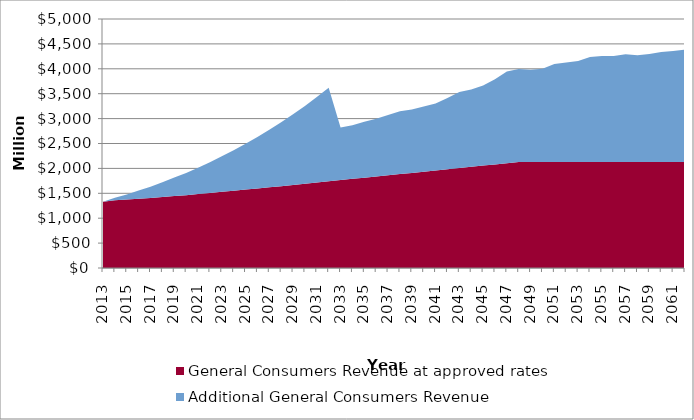
| Category | General Consumers Revenue at approved rates | Additional General Consumers Revenue |
|---|---|---|
| 2013.0 | 1331 | 0 |
| 2014.0 | 1361 | 48 |
| 2015.0 | 1374 | 104 |
| 2016.0 | 1390 | 164 |
| 2017.0 | 1404 | 228 |
| 2018.0 | 1424 | 297 |
| 2019.0 | 1447 | 370 |
| 2020.0 | 1462 | 447 |
| 2021.0 | 1485 | 530 |
| 2022.0 | 1506 | 619 |
| 2023.0 | 1529 | 713 |
| 2024.0 | 1552 | 814 |
| 2025.0 | 1575 | 921 |
| 2026.0 | 1598 | 1034 |
| 2027.0 | 1621 | 1154 |
| 2028.0 | 1644 | 1282 |
| 2029.0 | 1669 | 1418 |
| 2030.0 | 1693 | 1562 |
| 2031.0 | 1717 | 1715 |
| 2032.0 | 1741 | 1876 |
| 2033.0 | 1765 | 1057 |
| 2034.0 | 1790 | 1076 |
| 2035.0 | 1814 | 1123 |
| 2036.0 | 1838 | 1157 |
| 2037.0 | 1862 | 1211 |
| 2038.0 | 1886 | 1260 |
| 2039.0 | 1910 | 1275 |
| 2040.0 | 1935 | 1310 |
| 2041.0 | 1959 | 1345 |
| 2042.0 | 1983 | 1430 |
| 2043.0 | 2007 | 1526 |
| 2044.0 | 2031 | 1553 |
| 2045.0 | 2056 | 1609 |
| 2046.0 | 2080 | 1712 |
| 2047.0 | 2104 | 1844 |
| 2048.0 | 2128 | 1868 |
| 2049.0 | 2128 | 1852 |
| 2050.0 | 2128 | 1871 |
| 2051.0 | 2128 | 1968 |
| 2052.0 | 2128 | 2001 |
| 2053.0 | 2128 | 2027 |
| 2054.0 | 2128 | 2108 |
| 2055.0 | 2128 | 2131 |
| 2056.0 | 2128 | 2128 |
| 2057.0 | 2128 | 2165 |
| 2058.0 | 2128 | 2144 |
| 2059.0 | 2128 | 2170 |
| 2060.0 | 2128 | 2207 |
| 2061.0 | 2128 | 2228 |
| 2062.0 | 2128 | 2256 |